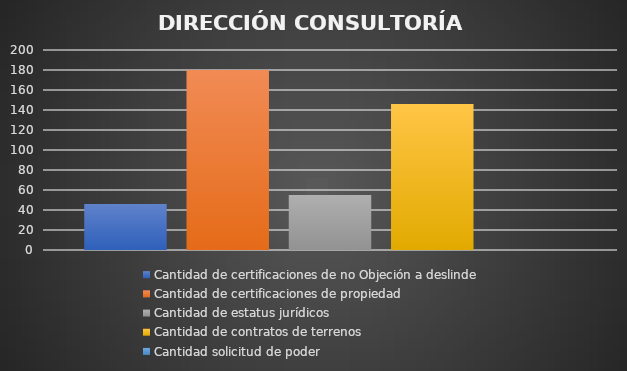
| Category | Cantidad de certificaciones de no Objeción a deslinde | Cantidad de certificaciones de propiedad | Cantidad de estatus jurídicos | Cantidad de contratos de terrenos | Cantidad solicitud de poder  |
|---|---|---|---|---|---|
| 0 | 46 | 180 | 55 | 146 | 0 |